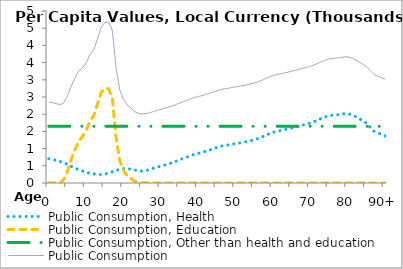
| Category | Public Consumption, Health | Public Consumption, Education | Public Consumption, Other than health and education | Public Consumption |
|---|---|---|---|---|
| 0 | 704.291 | 0 | 1648.652 | 2352.943 |
|  | 682.238 | 0 | 1648.652 | 2330.89 |
| 2 | 660.185 | 0 | 1648.652 | 2308.837 |
| 3 | 626.807 | 0 | 1648.652 | 2275.459 |
| 4 | 584.403 | 99.515 | 1648.652 | 2332.57 |
| 5 | 545.603 | 344.686 | 1648.652 | 2538.942 |
| 6 | 483.741 | 681.886 | 1648.652 | 2814.279 |
| 7 | 430.533 | 973.07 | 1648.652 | 3052.255 |
| 8 | 387.608 | 1219.418 | 1648.652 | 3255.678 |
| 9 | 349.121 | 1352.168 | 1648.652 | 3349.941 |
| 10 | 308.591 | 1530.348 | 1648.652 | 3487.592 |
| 11 | 283.511 | 1806.449 | 1648.652 | 3738.612 |
| 12 | 264.921 | 1953.814 | 1648.652 | 3867.387 |
| 13 | 248.766 | 2292.134 | 1648.652 | 4189.551 |
| 14 | 247.469 | 2632.075 | 1648.652 | 4528.196 |
| 15 | 260.737 | 2753.252 | 1648.652 | 4662.641 |
| 16 | 290.456 | 2741.037 | 1648.652 | 4680.144 |
| 17 | 326.402 | 2455.303 | 1648.652 | 4430.356 |
| 18 | 363.775 | 1311.603 | 1648.652 | 3324.03 |
| 19 | 405.235 | 643.488 | 1648.652 | 2697.374 |
| 20 | 418.395 | 364.876 | 1648.652 | 2431.923 |
| 21 | 422.107 | 191.042 | 1648.652 | 2261.8 |
| 22 | 400.752 | 131.544 | 1648.652 | 2180.948 |
| 23 | 377.772 | 45.703 | 1648.652 | 2072.127 |
| 24 | 355.621 | 15.696 | 1648.652 | 2019.969 |
| 25 | 349.948 | 7.679 | 1648.652 | 2006.278 |
| 26 | 363.134 | 5.841 | 1648.652 | 2017.627 |
| 27 | 392.186 | 0 | 1648.652 | 2040.837 |
| 28 | 430.999 | 0 | 1648.652 | 2079.651 |
| 29 | 463.631 | 0 | 1648.652 | 2112.283 |
| 30 | 489.466 | 0 | 1648.652 | 2138.118 |
| 31 | 523.551 | 0 | 1648.652 | 2172.202 |
| 32 | 557.53 | 0 | 1648.652 | 2206.182 |
| 33 | 589.861 | 0 | 1648.652 | 2238.513 |
| 34 | 630.887 | 0 | 1648.652 | 2279.539 |
| 35 | 678.016 | 0 | 1648.652 | 2326.668 |
| 36 | 716.064 | 0 | 1648.652 | 2364.716 |
| 37 | 755.856 | 0 | 1648.652 | 2404.508 |
| 38 | 799.741 | 0 | 1648.652 | 2448.392 |
| 39 | 836.279 | 0 | 1648.652 | 2484.931 |
| 40 | 863.041 | 0 | 1648.652 | 2511.693 |
| 41 | 892.63 | 0 | 1648.652 | 2541.282 |
| 42 | 924.144 | 0 | 1648.652 | 2572.796 |
| 43 | 955.646 | 0 | 1648.652 | 2604.298 |
| 44 | 995.895 | 0 | 1648.652 | 2644.547 |
| 45 | 1034.582 | 0 | 1648.652 | 2683.234 |
| 46 | 1067.43 | 0 | 1648.652 | 2716.082 |
| 47 | 1089.04 | 0 | 1648.652 | 2737.692 |
| 48 | 1103.673 | 0 | 1648.652 | 2752.325 |
| 49 | 1128.411 | 0 | 1648.652 | 2777.062 |
| 50 | 1145.895 | 0 | 1648.652 | 2794.547 |
| 51 | 1160.826 | 0 | 1648.652 | 2809.478 |
| 52 | 1183.363 | 0 | 1648.652 | 2832.015 |
| 53 | 1202.345 | 0 | 1648.652 | 2850.997 |
| 54 | 1229.195 | 0 | 1648.652 | 2877.847 |
| 55 | 1258.339 | 0 | 1648.652 | 2906.991 |
| 56 | 1294.74 | 0 | 1648.652 | 2943.392 |
| 57 | 1334.287 | 0 | 1648.652 | 2982.939 |
| 58 | 1385.194 | 0 | 1648.652 | 3033.846 |
| 59 | 1431.848 | 0 | 1648.652 | 3080.5 |
| 60 | 1473.116 | 0 | 1648.652 | 3121.768 |
| 61 | 1504.516 | 0 | 1648.652 | 3153.168 |
| 62 | 1523.856 | 0 | 1648.652 | 3172.508 |
| 63 | 1548.101 | 0 | 1648.652 | 3196.752 |
| 64 | 1573.421 | 0 | 1648.652 | 3222.073 |
| 65 | 1599.81 | 0 | 1648.652 | 3248.462 |
| 66 | 1629.209 | 0 | 1648.652 | 3277.861 |
| 67 | 1657.752 | 0 | 1648.652 | 3306.403 |
| 68 | 1685.763 | 0 | 1648.652 | 3334.414 |
| 69 | 1710.402 | 0 | 1648.652 | 3359.054 |
| 70 | 1745.309 | 0 | 1648.652 | 3393.96 |
| 71 | 1784.451 | 0 | 1648.652 | 3433.103 |
| 72 | 1830.524 | 0 | 1648.652 | 3479.176 |
| 73 | 1878.565 | 0 | 1648.652 | 3527.217 |
| 74 | 1921.295 | 0 | 1648.652 | 3569.947 |
| 75 | 1959.071 | 0 | 1648.652 | 3607.723 |
| 76 | 1972.589 | 0 | 1648.652 | 3621.241 |
| 77 | 1981.801 | 0 | 1648.652 | 3630.453 |
| 78 | 1995.739 | 0 | 1648.652 | 3644.39 |
| 79 | 2014.159 | 0 | 1648.652 | 3662.811 |
| 80 | 2017.455 | 0 | 1648.652 | 3666.107 |
| 81 | 1987.879 | 0 | 1648.652 | 3636.531 |
| 82 | 1937.747 | 0 | 1648.652 | 3586.399 |
| 83 | 1873.056 | 0 | 1648.652 | 3521.707 |
| 84 | 1811.216 | 0 | 1648.652 | 3459.867 |
| 85 | 1740.649 | 0 | 1648.652 | 3389.301 |
| 86 | 1621.005 | 0 | 1648.652 | 3269.657 |
| 87 | 1507.779 | 0 | 1648.652 | 3156.43 |
| 88 | 1460.596 | 0 | 1648.652 | 3109.247 |
| 89 | 1414.242 | 0 | 1648.652 | 3062.894 |
| 90+ | 1367.889 | 0 | 1648.652 | 3016.541 |